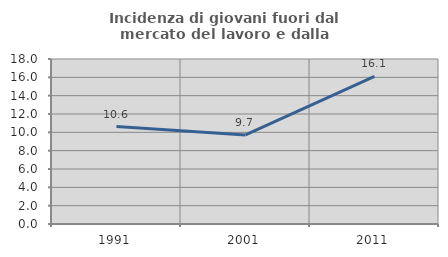
| Category | Incidenza di giovani fuori dal mercato del lavoro e dalla formazione  |
|---|---|
| 1991.0 | 10.628 |
| 2001.0 | 9.722 |
| 2011.0 | 16.098 |